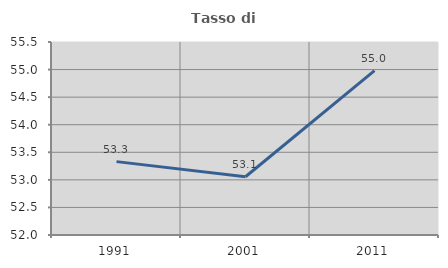
| Category | Tasso di occupazione   |
|---|---|
| 1991.0 | 53.331 |
| 2001.0 | 53.057 |
| 2011.0 | 54.981 |